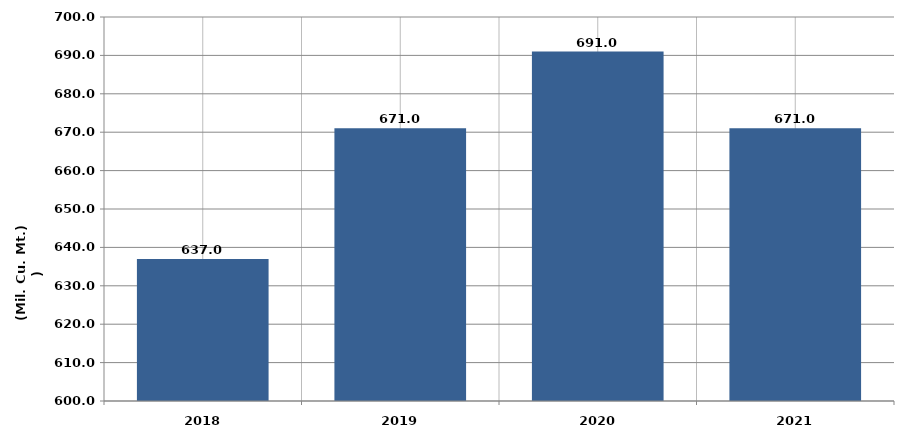
| Category |  انتاج المياه 
( مليون متر مكعب  ) |
|---|---|
| 2018.0 | 637 |
| 2019.0 | 671 |
| 2020.0 | 691 |
| 2021.0 | 671 |